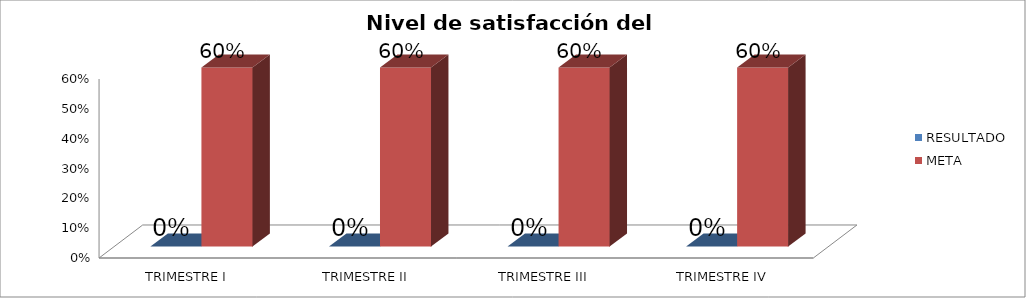
| Category | RESULTADO | META |
|---|---|---|
| TRIMESTRE I | 0 | 0.6 |
| TRIMESTRE II | 0 | 0.6 |
| TRIMESTRE III | 0 | 0.6 |
| TRIMESTRE IV | 0 | 0.6 |